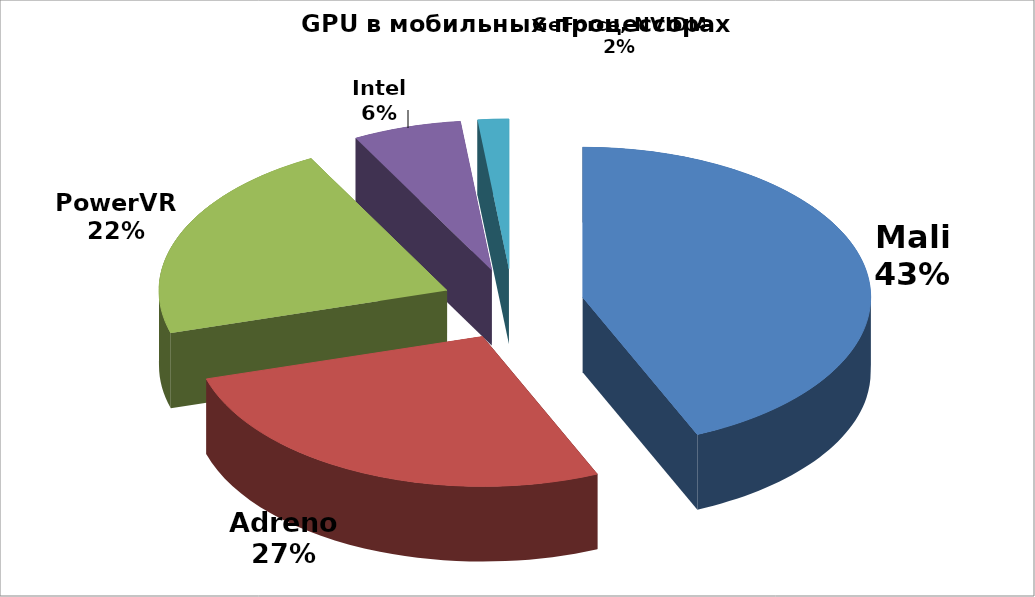
| Category | Series 0 |
|---|---|
| Mali | 50 |
| Adreno | 31 |
| PowerVR | 25 |
| Intel | 7 |
| GeForce, NVIDIA | 2 |